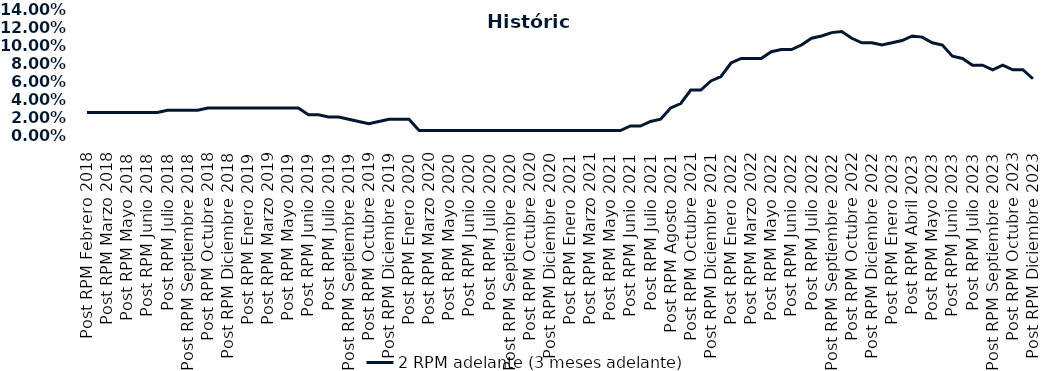
| Category | 2 RPM adelante (3 meses adelante) |
|---|---|
| Post RPM Febrero 2018 | 0.025 |
| Pre RPM Marzo 2018 | 0.025 |
| Post RPM Marzo 2018 | 0.025 |
| Pre RPM Mayo 2018 | 0.025 |
| Post RPM Mayo 2018 | 0.025 |
| Pre RPM Junio 2018 | 0.025 |
| Post RPM Junio 2018 | 0.025 |
| Pre RPM Julio 2018 | 0.025 |
| Post RPM Julio 2018 | 0.028 |
| Pre RPM Septiembre 2018 | 0.028 |
| Post RPM Septiembre 2018 | 0.028 |
| Pre RPM Octubre 2018 | 0.028 |
| Post RPM Octubre 2018 | 0.03 |
| Pre RPM Diciembre 2018 | 0.03 |
| Post RPM Diciembre 2018 | 0.03 |
| Pre RPM Enero 2019 | 0.03 |
| Post RPM Enero 2019 | 0.03 |
| Pre RPM Marzo 2019 | 0.03 |
| Post RPM Marzo 2019 | 0.03 |
| Pre RPM Mayo 2019 | 0.03 |
| Post RPM Mayo 2019 | 0.03 |
| Pre RPM Junio 2019 | 0.03 |
| Post RPM Junio 2019 | 0.022 |
| Pre RPM Julio 2019 | 0.022 |
| Post RPM Julio 2019 | 0.02 |
| Pre RPM Septiembre 2019 | 0.02 |
| Post RPM Septiembre 2019 | 0.018 |
| Pre RPM Octubre 2019 | 0.015 |
| Post RPM Octubre 2019 | 0.012 |
| Pre RPM Diciembre 2019 | 0.015 |
| Post RPM Diciembre 2019 | 0.018 |
| Pre RPM Enero 2020 | 0.018 |
| Post RPM Enero 2020 | 0.018 |
| Pre RPM Marzo 2020 | 0.005 |
| Post RPM Marzo 2020 | 0.005 |
| Pre RPM Mayo 2020 | 0.005 |
| Post RPM Mayo 2020 | 0.005 |
| Pre RPM Junio 2020 | 0.005 |
| Post RPM Junio 2020 | 0.005 |
| Pre RPM Julio 2020 | 0.005 |
| Post RPM Julio 2020 | 0.005 |
| Pre RPM Septiembre 2020 | 0.005 |
| Post RPM Septiembre 2020 | 0.005 |
| Pre RPM Octubre 2020 | 0.005 |
| Post RPM Octubre 2020 | 0.005 |
| Pre RPM Diciembre 2020 | 0.005 |
| Post RPM Diciembre 2020 | 0.005 |
| Pre RPM Enero 2021 | 0.005 |
| Post RPM Enero 2021 | 0.005 |
| Pre RPM Marzo 2021 | 0.005 |
| Post RPM Marzo 2021 | 0.005 |
| Pre RPM Mayo 2021 | 0.005 |
| Post RPM Mayo 2021 | 0.005 |
| Pre RPM Junio 2021 | 0.005 |
| Post RPM Junio 2021 | 0.01 |
| Pre RPM Julio 2021 | 0.01 |
| Post RPM Julio 2021 | 0.015 |
| Pre RPM Agosto 2021 | 0.018 |
| Post RPM Agosto 2021 | 0.03 |
| Pre RPM Octubre 2021 | 0.035 |
| Post RPM Octubre 2021 | 0.05 |
| Pre RPM Diciembre 2021 | 0.05 |
| Post RPM Diciembre 2021 | 0.06 |
| Pre RPM Enero 2022 | 0.065 |
| Post RPM Enero 2022 | 0.08 |
| Pre RPM Marzo 2022 | 0.085 |
| Post RPM Marzo 2022 | 0.085 |
| Pre RPM Mayo 2022 | 0.085 |
| Post RPM Mayo 2022 | 0.092 |
| Pre RPM Junio 2022 | 0.095 |
| Post RPM Junio 2022 | 0.095 |
| Pre RPM Julio 2022 | 0.1 |
| Post RPM Julio 2022 | 0.108 |
| Pre RPM Septiembre 2022 | 0.11 |
| Post RPM Septiembre 2022 | 0.114 |
| Pre RPM Octubre 2022 | 0.115 |
| Post RPM Octubre 2022 | 0.108 |
| Pre RPM Diciembre 2022 | 0.102 |
| Post RPM Diciembre 2022 | 0.102 |
| Pre RPM Enero 2023 | 0.1 |
| Post RPM Enero 2023 | 0.102 |
| Pre RPM Abril 2023 | 0.105 |
| Post RPM Abril 2023 | 0.11 |
| Pre RPM Mayo 2023 | 0.109 |
| Post RPM Mayo 2023 | 0.102 |
| Pre RPM Junio 2023 | 0.1 |
| Post RPM Junio 2023 | 0.088 |
| Pre RPM Julio 2023 | 0.085 |
| Post RPM Julio 2023 | 0.078 |
| Pre RPM Septiembre 2023 | 0.078 |
| Post RPM Septiembre 2023 | 0.072 |
| Pre RPM Octubre 2023 | 0.078 |
| Post RPM Octubre 2023 | 0.072 |
| Pre RPM Diciembre 2023 | 0.072 |
| Post RPM Diciembre 2023 | 0.062 |